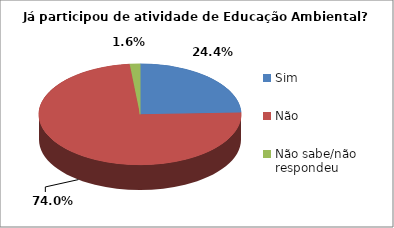
| Category | Series 0 |
|---|---|
| Sim | 30 |
| Não | 91 |
| Não sabe/não respondeu | 2 |